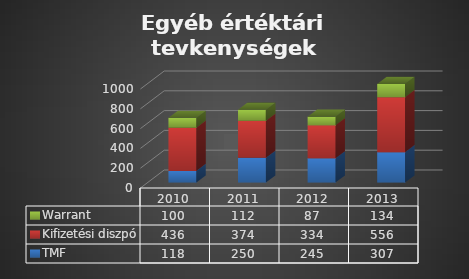
| Category | TMF | Kifizetési diszpó | Warrant |
|---|---|---|---|
| 2010.0 | 118 | 436 | 100 |
| 2011.0 | 250 | 374 | 112 |
| 2012.0 | 245 | 334 | 87 |
| 2013.0 | 307 | 556 | 134 |